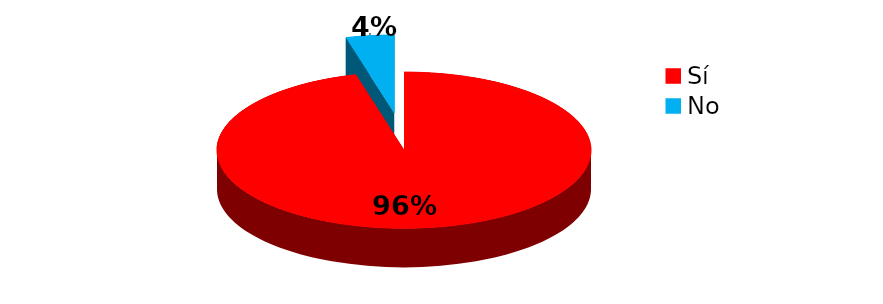
| Category | Series 0 |
|---|---|
| Sí | 207 |
| No | 9 |